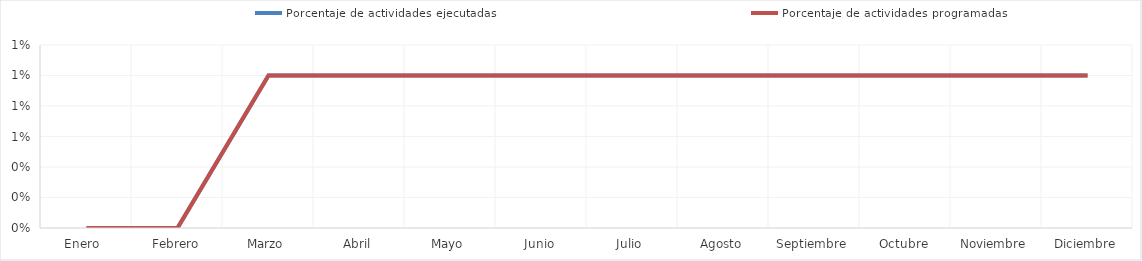
| Category | Porcentaje de actividades ejecutadas  | Porcentaje de actividades programadas |
|---|---|---|
| Enero  | 0 | 0 |
| Febrero | 0 | 0 |
| Marzo | 0.01 | 0.01 |
| Abril | 0.01 | 0.01 |
| Mayo | 0.01 | 0.01 |
| Junio | 0.01 | 0.01 |
| Julio | 0.01 | 0.01 |
| Agosto | 0.01 | 0.01 |
| Septiembre | 0.01 | 0.01 |
| Octubre | 0.01 | 0.01 |
| Noviembre | 0.01 | 0.01 |
| Diciembre | 0.01 | 0.01 |